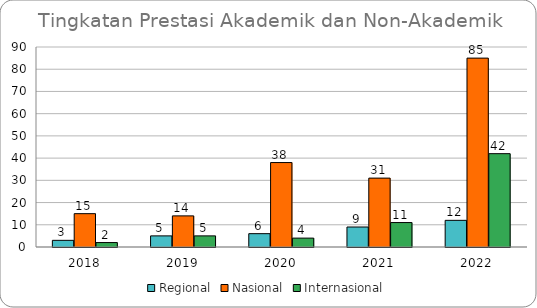
| Category | Regional | Nasional | Internasional |
|---|---|---|---|
| 2018.0 | 3 | 15 | 2 |
| 2019.0 | 5 | 14 | 5 |
| 2020.0 | 6 | 38 | 4 |
| 2021.0 | 9 | 31 | 11 |
| 2022.0 | 12 | 85 | 42 |